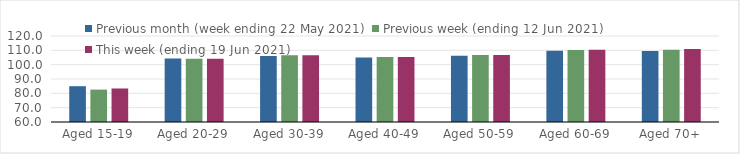
| Category | Previous month (week ending 22 May 2021) | Previous week (ending 12 Jun 2021) | This week (ending 19 Jun 2021) |
|---|---|---|---|
| Aged 15-19 | 84.98 | 82.6 | 83.39 |
| Aged 20-29 | 104.27 | 104.14 | 104.08 |
| Aged 30-39 | 106.11 | 106.58 | 106.65 |
| Aged 40-49 | 104.97 | 105.34 | 105.4 |
| Aged 50-59 | 106.26 | 106.73 | 106.8 |
| Aged 60-69 | 109.77 | 110.21 | 110.37 |
| Aged 70+ | 109.49 | 110.46 | 110.88 |